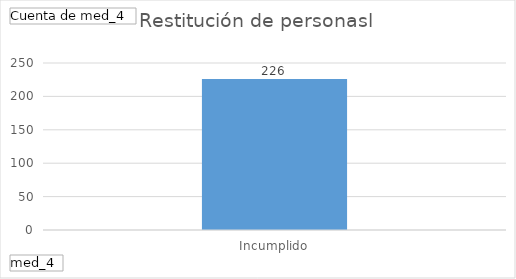
| Category | Total |
|---|---|
| Incumplido | 226 |